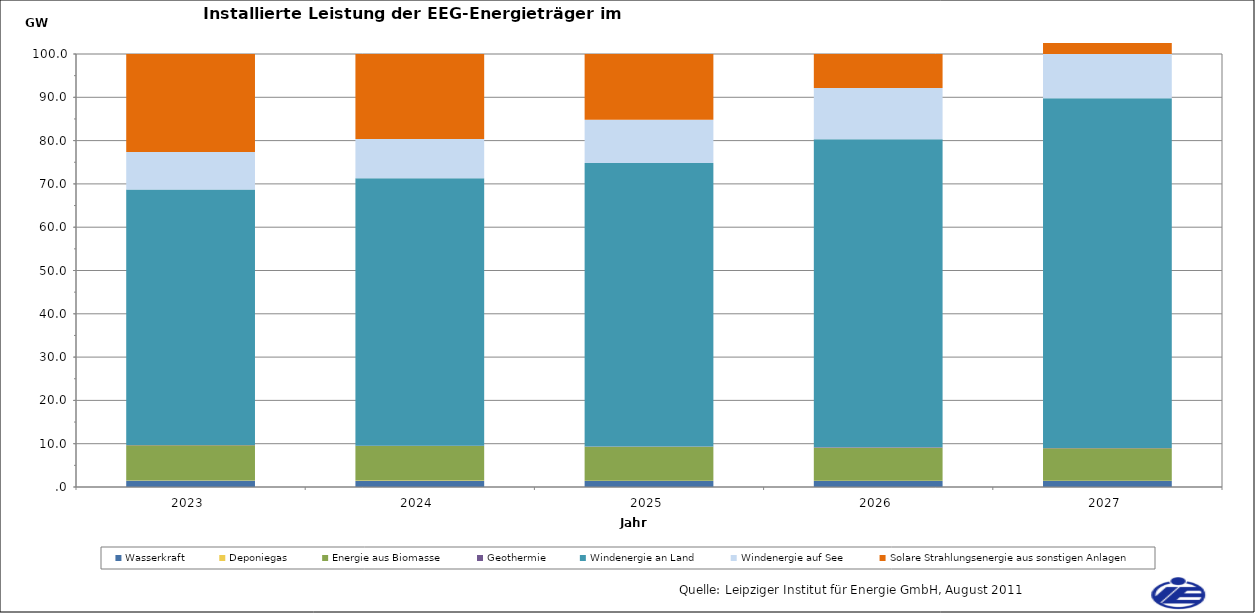
| Category | Wasserkraft | Deponiegas | Energie aus Biomasse | Geothermie | Windenergie an Land | Windenergie auf See | Solare Strahlungsenergie aus sonstigen Anlagen |
|---|---|---|---|---|---|---|---|
| 2023.0 | 1424.26 | 79.153 | 8157.264 | 58.252 | 59010.05 | 8625.818 | 46656.818 |
| 2024.0 | 1410.662 | 77.402 | 7979.979 | 70.252 | 61745.439 | 9093.818 | 51990.753 |
| 2025.0 | 1395.865 | 73.826 | 7801.287 | 82.252 | 65488.589 | 9993.818 | 58751.541 |
| 2026.0 | 1381.897 | 60.764 | 7620.241 | 94.252 | 71160.78 | 11851.818 | 67297.146 |
| 2027.0 | 1367.628 | 58.962 | 7494.239 | 110.252 | 80728.604 | 12781.818 | 78120.531 |